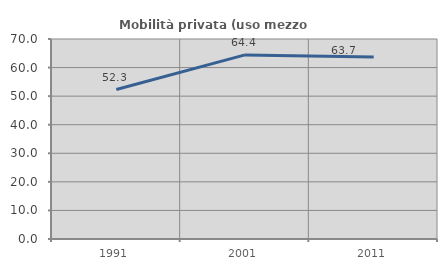
| Category | Mobilità privata (uso mezzo privato) |
|---|---|
| 1991.0 | 52.319 |
| 2001.0 | 64.435 |
| 2011.0 | 63.675 |